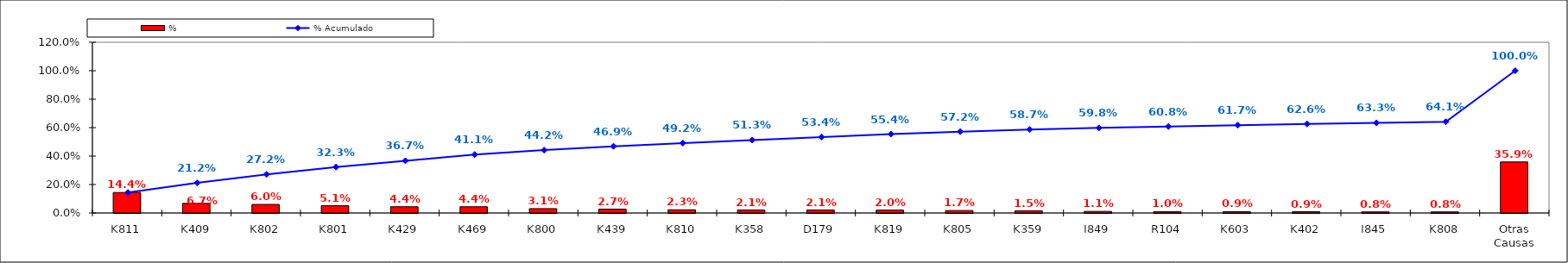
| Category | % |
|---|---|
| K811 | 0.144 |
| K409 | 0.067 |
| K802 | 0.06 |
| K801 | 0.051 |
| K429 | 0.044 |
| K469 | 0.044 |
| K800 | 0.031 |
| K439 | 0.027 |
| K810 | 0.023 |
| K358 | 0.021 |
| D179 | 0.021 |
| K819 | 0.02 |
| K805 | 0.017 |
| K359 | 0.015 |
| I849 | 0.011 |
| R104 | 0.01 |
| K603 | 0.009 |
| K402 | 0.009 |
| I845 | 0.008 |
| K808 | 0.008 |
| Otras Causas | 0.359 |